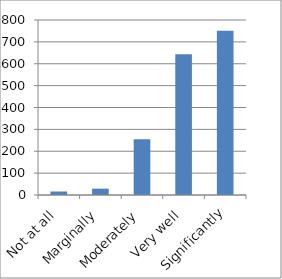
| Category | Series 0 |
|---|---|
| Not at all | 16 |
| Marginally | 29 |
|  Moderately | 255 |
| Very well | 643 |
| Significantly | 751 |